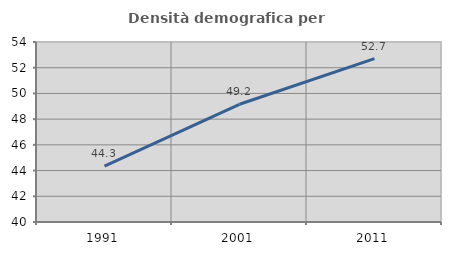
| Category | Densità demografica |
|---|---|
| 1991.0 | 44.341 |
| 2001.0 | 49.155 |
| 2011.0 | 52.711 |